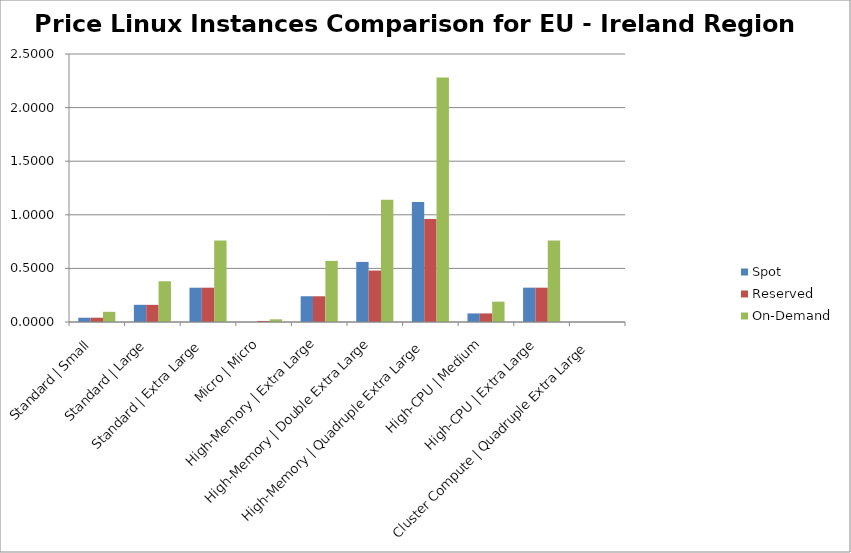
| Category | Spot | Reserved | On-Demand |
|---|---|---|---|
| Standard | Small | 0.04 | 0.04 | 0.095 |
| Standard | Large | 0.16 | 0.16 | 0.38 |
| Standard | Extra Large | 0.32 | 0.32 | 0.76 |
| Micro | Micro | 0 | 0.01 | 0.025 |
| High-Memory | Extra Large | 0.24 | 0.24 | 0.57 |
| High-Memory | Double Extra Large | 0.561 | 0.48 | 1.14 |
| High-Memory | Quadruple Extra Large | 1.12 | 0.96 | 2.28 |
| High-CPU | Medium | 0.08 | 0.08 | 0.19 |
| High-CPU | Extra Large | 0.32 | 0.32 | 0.76 |
| Cluster Compute | Quadruple Extra Large | 0 | 0 | 0 |